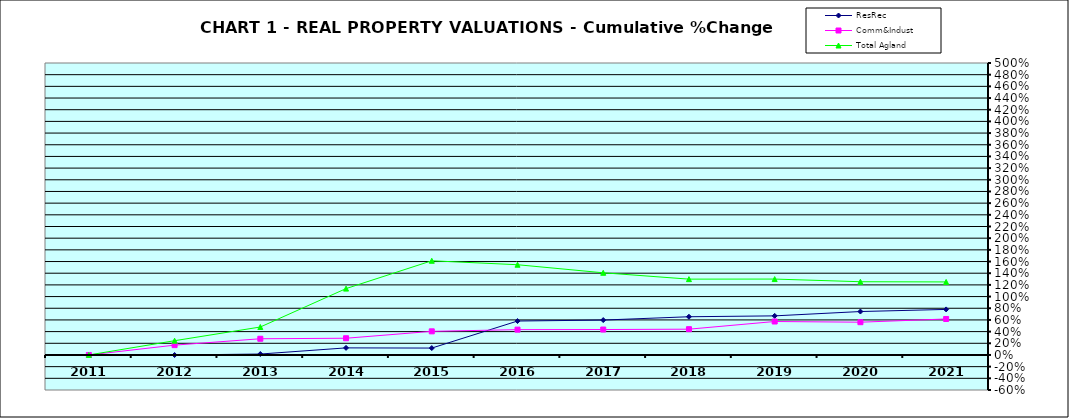
| Category | ResRec | Comm&Indust | Total Agland |
|---|---|---|---|
| 2011.0 | 0 | 0 | 0 |
| 2012.0 | -0.001 | 0.168 | 0.244 |
| 2013.0 | 0.016 | 0.278 | 0.479 |
| 2014.0 | 0.121 | 0.286 | 1.136 |
| 2015.0 | 0.118 | 0.405 | 1.613 |
| 2016.0 | 0.581 | 0.434 | 1.545 |
| 2017.0 | 0.598 | 0.435 | 1.407 |
| 2018.0 | 0.655 | 0.441 | 1.299 |
| 2019.0 | 0.67 | 0.573 | 1.3 |
| 2020.0 | 0.744 | 0.561 | 1.254 |
| 2021.0 | 0.78 | 0.616 | 1.251 |